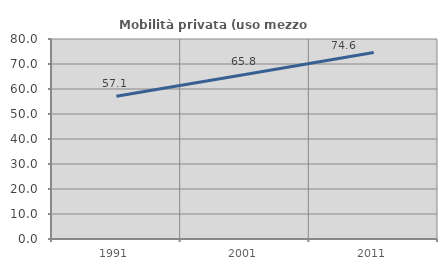
| Category | Mobilità privata (uso mezzo privato) |
|---|---|
| 1991.0 | 57.104 |
| 2001.0 | 65.811 |
| 2011.0 | 74.63 |